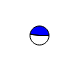
| Category | Series 0 |
|---|---|
| 0 | 3302205 |
| 1 | 3023377 |